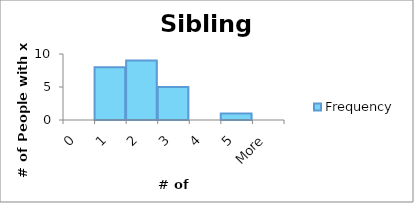
| Category | Frequency |
|---|---|
| 0 | 0 |
| 1 | 8 |
| 2 | 9 |
| 3 | 5 |
| 4 | 0 |
| 5 | 1 |
| More | 0 |